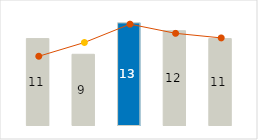
| Category | Other variable cost |
|---|---|
| 0 | 11 |
| 1 | 9 |
| 2 | 13 |
| 3 | 12 |
| 4 | 11 |